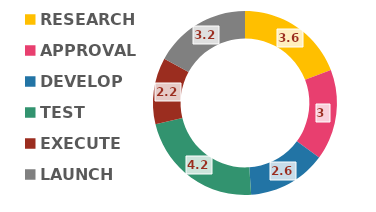
| Category | Series 0 |
|---|---|
| RESEARCH | 3.6 |
| APPROVAL | 3 |
| DEVELOP | 2.6 |
| TEST | 4.2 |
| EXECUTE | 2.2 |
| LAUNCH | 3.2 |